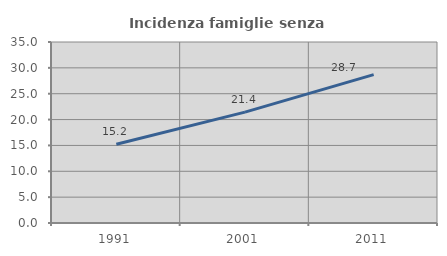
| Category | Incidenza famiglie senza nuclei |
|---|---|
| 1991.0 | 15.233 |
| 2001.0 | 21.445 |
| 2011.0 | 28.7 |